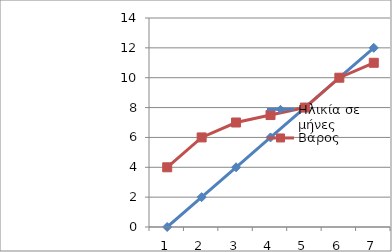
| Category | Ηλικία σε μήνες | Βάρος |
|---|---|---|
| 0 | 0 | 4 |
| 1 | 2 | 6 |
| 2 | 4 | 7 |
| 3 | 6 | 7.5 |
| 4 | 8 | 8 |
| 5 | 10 | 10 |
| 6 | 12 | 11 |